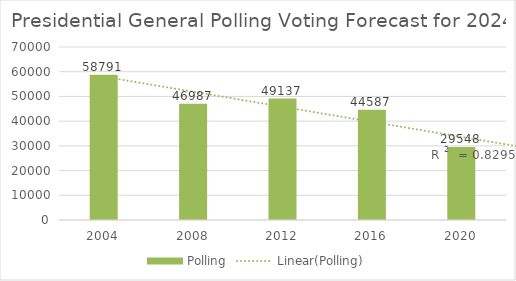
| Category | Polling |
|---|---|
| 2004.0 | 58791 |
| 2008.0 | 46987 |
| 2012.0 | 49137 |
| 2016.0 | 44587 |
| 2020.0 | 29548 |